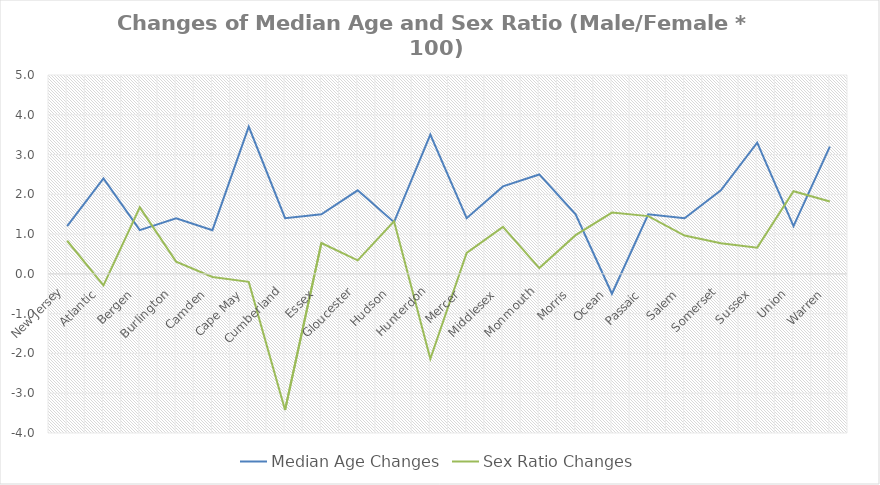
| Category | Median Age Changes | Sex Ratio Changes |
|---|---|---|
| New Jersey | 1.2 | 0.833 |
| Atlantic  | 2.4 | -0.291 |
| Bergen  | 1.1 | 1.672 |
| Burlington  | 1.4 | 0.308 |
| Camden  | 1.1 | -0.076 |
| Cape May  | 3.7 | -0.201 |
| Cumberland | 1.4 | -3.42 |
| Essex  | 1.5 | 0.776 |
| Gloucester | 2.1 | 0.34 |
| Hudson  | 1.3 | 1.32 |
| Hunterdon | 3.5 | -2.132 |
| Mercer  | 1.4 | 0.528 |
| Middlesex  | 2.2 | 1.183 |
| Monmouth | 2.5 | 0.147 |
| Morris  | 1.5 | 0.973 |
| Ocean  | -0.5 | 1.541 |
| Passaic  | 1.5 | 1.452 |
| Salem  | 1.4 | 0.963 |
| Somerset | 2.1 | 0.771 |
| Sussex  | 3.3 | 0.66 |
| Union  | 1.2 | 2.077 |
| Warren  | 3.2 | 1.82 |